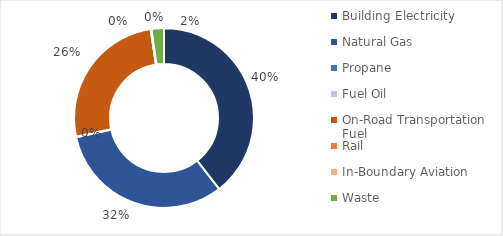
| Category | Series 0 |
|---|---|
| Building Electricity | 665383.553 |
| Natural Gas | 539952.029 |
| Propane | 1988.5 |
| Fuel Oil | 0 |
| On-Road Transportation Fuel | 437021.66 |
| Rail | 135.545 |
| In-Boundary Aviation | 2323.471 |
| Waste | 37464.449 |